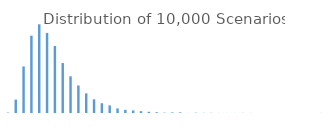
| Category | Series 0 |
|---|---|
| 0 | 7 |
| 1 | 241 |
| 2 | 839 |
| 3 | 1393 |
| 4 | 1598 |
| 5 | 1443 |
| 6 | 1207 |
| 7 | 900 |
| 8 | 661 |
| 9 | 496 |
| 10 | 354 |
| 11 | 247 |
| 12 | 176 |
| 13 | 137 |
| 14 | 83 |
| 15 | 57 |
| 16 | 46 |
| 17 | 33 |
| 18 | 22 |
| 19 | 14 |
| 20 | 6 |
| 21 | 10 |
| 22 | 11 |
| 23 | 1 |
| 24 | 5 |
| 25 | 3 |
| 26 | 3 |
| 27 | 1 |
| 28 | 1 |
| 29 | 1 |
| 30 | 2 |
| 31 | 1 |
| 32 | 0 |
| 33 | 0 |
| 34 | 0 |
| 35 | 0 |
| 36 | 0 |
| 37 | 0 |
| 38 | 0 |
| 39 | 0 |
| 40 | 1 |